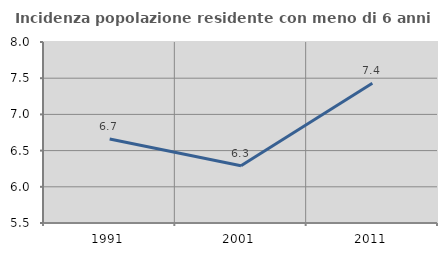
| Category | Incidenza popolazione residente con meno di 6 anni |
|---|---|
| 1991.0 | 6.66 |
| 2001.0 | 6.291 |
| 2011.0 | 7.43 |